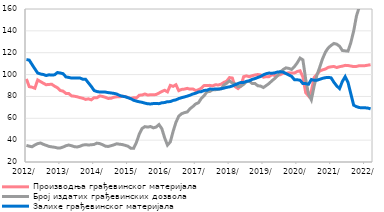
| Category | Производња грађевинског материјала |
|---|---|
| 2012-01-01 | 96.016 |
| 2012-02-01 | 88.95 |
| 2012-03-01 | 88.467 |
| 2012-04-01 | 87.481 |
| 2012-05-01 | 95.091 |
| 2012-06-01 | 93.558 |
| 2012-07-01 | 92.077 |
| 2012-08-01 | 90.691 |
| 2012-09-01 | 90.994 |
| 2012-10-01 | 91.111 |
| 2012-11-01 | 89.331 |
| 2012-12-01 | 87.945 |
| 2013-01-01 | 85.454 |
| 2013-02-01 | 84.848 |
| 2013-03-01 | 82.781 |
| 2013-04-01 | 82.673 |
| 2013-05-01 | 80.485 |
| 2013-06-01 | 80.19 |
| 2013-07-01 | 79.675 |
| 2013-08-01 | 78.882 |
| 2013-09-01 | 78.318 |
| 2013-10-01 | 77.271 |
| 2013-11-01 | 77.805 |
| 2013-12-01 | 76.907 |
| 2014-01-01 | 78.841 |
| 2014-02-01 | 78.763 |
| 2014-03-01 | 80.454 |
| 2014-04-01 | 79.968 |
| 2014-05-01 | 79.156 |
| 2014-06-01 | 78.17 |
| 2014-07-01 | 78.321 |
| 2014-08-01 | 79.254 |
| 2014-09-01 | 79.624 |
| 2014-10-01 | 79.647 |
| 2014-11-01 | 80.089 |
| 2014-12-01 | 80.022 |
| 2015-01-01 | 78.973 |
| 2015-02-01 | 78.237 |
| 2015-03-01 | 78.797 |
| 2015-04-01 | 78.642 |
| 2015-05-01 | 81.11 |
| 2015-06-01 | 81.306 |
| 2015-07-01 | 82.226 |
| 2015-08-01 | 81.281 |
| 2015-09-01 | 81.522 |
| 2015-10-01 | 81.442 |
| 2015-11-01 | 81.779 |
| 2015-12-01 | 83.108 |
| 2016-01-01 | 84.534 |
| 2016-02-01 | 85.647 |
| 2016-03-01 | 84.168 |
| 2016-04-01 | 90.094 |
| 2016-05-01 | 89.202 |
| 2016-06-01 | 90.691 |
| 2016-07-01 | 85.263 |
| 2016-08-01 | 86.41 |
| 2016-09-01 | 86.716 |
| 2016-10-01 | 87.373 |
| 2016-11-01 | 86.66 |
| 2016-12-01 | 86.873 |
| 2017-01-01 | 85.346 |
| 2017-02-01 | 86.134 |
| 2017-03-01 | 87.556 |
| 2017-04-01 | 90.015 |
| 2017-05-01 | 89.975 |
| 2017-06-01 | 90.124 |
| 2017-07-01 | 89.6 |
| 2017-08-01 | 90.7 |
| 2017-09-01 | 90.461 |
| 2017-10-01 | 91.21 |
| 2017-11-01 | 92.832 |
| 2017-12-01 | 94.011 |
| 2018-01-01 | 97.279 |
| 2018-02-01 | 96.819 |
| 2018-03-01 | 88.92 |
| 2018-04-01 | 87.197 |
| 2018-05-01 | 89.388 |
| 2018-06-01 | 98.064 |
| 2018-07-01 | 98.829 |
| 2018-08-01 | 98.009 |
| 2018-09-01 | 98.927 |
| 2018-10-31 | 99.639 |
| 2018-11-30 | 100.037 |
| 2018-12-31 | 99.706 |
| 2019-01-31 | 97.576 |
| 2019-02-28 | 98.121 |
| 2019-03-31 | 98.091 |
| 2019-04-30 | 99.95 |
| 2019-05-31 | 99.106 |
| 2019-06-30 | 99.345 |
| 2019-07-31 | 99.907 |
| 2019-08-31 | 101.188 |
| 2019-09-30 | 101.164 |
| 2019-10-31 | 101.598 |
| 2019-11-30 | 101.364 |
| 2019-12-31 | 101.4 |
| 2020-01-31 | 102.822 |
| 2020-02-29 | 103.457 |
| 2020-03-31 | 97.805 |
| 2020-04-30 | 83.428 |
| 2020-05-31 | 80.399 |
| 2020-06-30 | 85.001 |
| 2020-07-31 | 97.344 |
| 2020-08-31 | 100.283 |
| 2020-09-30 | 103.307 |
| 2020-10-31 | 104.315 |
| 2020-11-30 | 105.109 |
| 2020-12-31 | 106.615 |
| 2021-01-31 | 107.14 |
| 2021-02-28 | 107.401 |
| 2021-03-31 | 106.446 |
| 2021-04-30 | 107.229 |
| 2021-05-31 | 107.69 |
| 2021-06-30 | 108.428 |
| 2021-07-31 | 108.288 |
| 2021-08-31 | 107.812 |
| 2021-09-30 | 107.279 |
| 2021-10-31 | 107.462 |
| 2021-11-30 | 108.145 |
| 2021-12-31 | 108.051 |
| 2022-01-31 | 108.171 |
| 2022-02-28 | 108.573 |
| 2022-03-31 | 109.017 |